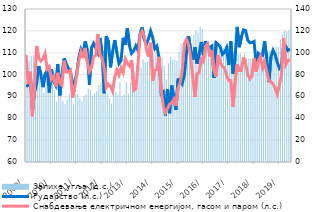
| Category | Залихе угља (д.с.) |
|---|---|
| 2009-01-01 | 93.917 |
| 2009-02-01 | 92.739 |
| 2009-03-01 | 96.956 |
| 2009-04-01 | 97.784 |
| 2009-05-01 | 82.654 |
| 2009-06-01 | 75.178 |
| 2009-07-01 | 88.498 |
| 2009-08-01 | 71.701 |
| 2009-09-01 | 63.176 |
| 2009-10-01 | 74.661 |
| 2009-11-01 | 74.445 |
| 2009-12-01 | 66.096 |
| 2010-01-01 | 72.477 |
| 2010-02-01 | 65.362 |
| 2010-03-01 | 55.212 |
| 2010-04-01 | 63.393 |
| 2010-05-01 | 63.963 |
| 2010-06-01 | 56.206 |
| 2010-07-01 | 52.777 |
| 2010-08-01 | 56.865 |
| 2010-09-01 | 62.434 |
| 2010-10-01 | 64.069 |
| 2010-11-01 | 52.66 |
| 2010-12-01 | 62.133 |
| 2011-01-01 | 62.662 |
| 2011-02-01 | 58.584 |
| 2011-03-01 | 55.493 |
| 2011-04-01 | 60.708 |
| 2011-05-01 | 61.786 |
| 2011-06-01 | 67.173 |
| 2011-07-01 | 66.269 |
| 2011-08-01 | 60.737 |
| 2011-09-01 | 62.722 |
| 2011-10-01 | 65.002 |
| 2011-11-01 | 70.207 |
| 2011-12-01 | 73.177 |
| 2012-01-01 | 73.389 |
| 2012-02-01 | 69.422 |
| 2012-03-01 | 62.181 |
| 2012-04-01 | 58.663 |
| 2012-05-01 | 53.522 |
| 2012-06-01 | 68.013 |
| 2012-07-01 | 64.071 |
| 2012-08-01 | 61.795 |
| 2012-09-01 | 73.033 |
| 2012-10-01 | 60.087 |
| 2012-11-01 | 61.555 |
| 2012-12-01 | 73.434 |
| 2013-01-01 | 62.387 |
| 2013-02-01 | 72.444 |
| 2013-03-01 | 88.258 |
| 2013-04-01 | 83.431 |
| 2013-05-01 | 88.584 |
| 2013-06-01 | 87.93 |
| 2013-07-01 | 86.317 |
| 2013-08-01 | 93.92 |
| 2013-09-01 | 91.724 |
| 2013-10-01 | 91.917 |
| 2013-11-01 | 99.824 |
| 2013-12-01 | 95.361 |
| 2014-01-01 | 99.423 |
| 2014-02-01 | 99.191 |
| 2014-03-01 | 94.882 |
| 2014-04-01 | 94.342 |
| 2014-05-01 | 95.478 |
| 2014-06-01 | 88.144 |
| 2014-07-01 | 75.74 |
| 2014-08-01 | 90.369 |
| 2014-09-01 | 96.07 |
| 2014-10-01 | 93.766 |
| 2014-11-01 | 93.325 |
| 2014-12-01 | 92.686 |
| 2015-01-01 | 100.16 |
| 2015-02-01 | 108.381 |
| 2015-03-01 | 105.363 |
| 2015-04-01 | 105.334 |
| 2015-05-01 | 115.947 |
| 2015-06-01 | 109.015 |
| 2015-07-01 | 105.749 |
| 2015-08-01 | 116.279 |
| 2015-09-01 | 120.215 |
| 2015-10-01 | 118.6 |
| 2015-11-01 | 123.924 |
| 2015-12-01 | 121.947 |
| 2016-01-01 | 109.578 |
| 2016-02-01 | 104.285 |
| 2016-03-01 | 103.648 |
| 2016-04-01 | 97.483 |
| 2016-05-01 | 103.65 |
| 2016-06-01 | 101.132 |
| 2016-07-01 | 106.699 |
| 2016-08-01 | 102.372 |
| 2016-09-01 | 106.253 |
| 2016-10-01 | 104.246 |
| 2016-11-01 | 105.8 |
| 2016-12-01 | 103.61 |
| 2017-01-01 | 110.056 |
| 2017-02-01 | 106.19 |
| 2017-03-01 | 101.27 |
| 2017-04-01 | 103.107 |
| 2017-05-01 | 99.153 |
| 2017-06-01 | 98.985 |
| 2017-07-01 | 96.38 |
| 2017-08-01 | 99.499 |
| 2017-09-01 | 94.248 |
| 2017-10-01 | 94.565 |
| 2017-11-01 | 94.379 |
| 2017-12-01 | 93.005 |
| 2018-01-01 | 93.59 |
| 2018-02-01 | 97.992 |
| 2018-03-01 | 98.522 |
| 2018-04-01 | 102.804 |
| 2018-05-01 | 101.087 |
| 2018-06-01 | 103.869 |
| 2018-07-01 | 99.78 |
| 2018-08-01 | 101.791 |
| 2018-09-01 | 101.348 |
| 2018-10-31 | 101.663 |
| 2018-11-30 | 105.586 |
| 2018-12-31 | 105.53 |
| 2019-01-31 | 112.015 |
| 2019-02-28 | 116.496 |
| 2019-03-31 | 120.179 |
| 2019-04-30 | 119.654 |
| 2019-05-31 | 121.104 |
| 2019-06-30 | 121.904 |